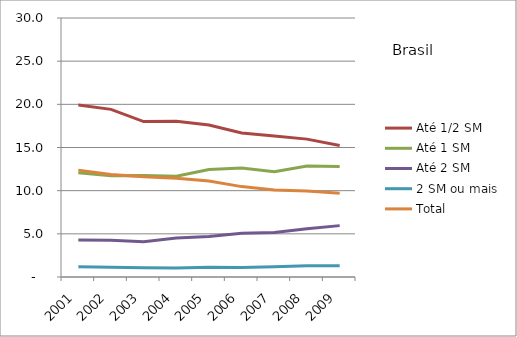
| Category | Até 1/2 SM | Até 1 SM | Até 2 SM | 2 SM ou mais | Total |
|---|---|---|---|---|---|
| 2001.0 | 19.92 | 12.07 | 4.28 | 1.2 | 12.38 |
| 2002.0 | 19.42 | 11.73 | 4.25 | 1.12 | 11.87 |
| 2003.0 | 18 | 11.76 | 4.08 | 1.08 | 11.6 |
| 2004.0 | 18.04 | 11.66 | 4.51 | 1.03 | 11.45 |
| 2005.0 | 17.61 | 12.46 | 4.69 | 1.13 | 11.13 |
| 2006.0 | 16.69 | 12.63 | 5.08 | 1.1 | 10.47 |
| 2007.0 | 16.32 | 12.19 | 5.15 | 1.2 | 10.09 |
| 2008.0 | 15.97 | 12.85 | 5.58 | 1.29 | 9.96 |
| 2009.0 | 15.24 | 12.79 | 5.95 | 1.31 | 9.7 |